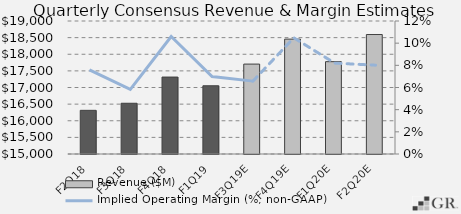
| Category | Revenue ($M) |
|---|---|
|  F2Q18  | 16313 |
|  F3Q18  | 16526 |
|  F4Q18  | 17314 |
|  F1Q19  | 17052 |
|  F3Q19E  | 17704.368 |
|  F4Q19E  | 18454.737 |
|  F1Q20E  | 17777.25 |
|  F2Q20E  | 18593.143 |